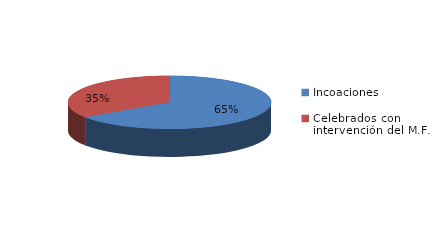
| Category | Series 0 |
|---|---|
| Incoaciones | 1866 |
| Celebrados con intervención del M.F. | 983 |